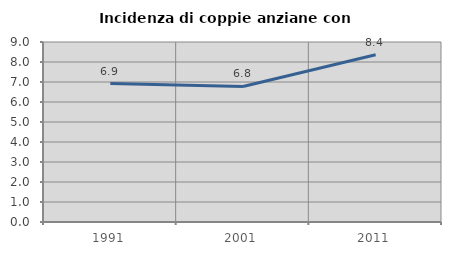
| Category | Incidenza di coppie anziane con figli |
|---|---|
| 1991.0 | 6.921 |
| 2001.0 | 6.775 |
| 2011.0 | 8.361 |